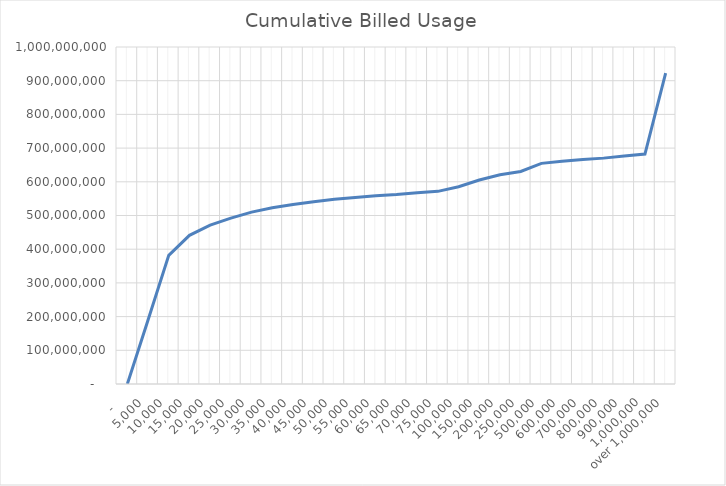
| Category | Series 0 |
|---|---|
|  -    | 0 |
|  5,000  | 189879200 |
|  10,000  | 381598700 |
|  15,000  | 441239800 |
|  20,000  | 471697300 |
|  25,000  | 492078800 |
|  30,000  | 509942700 |
|  35,000  | 523206500 |
|  40,000  | 532767800 |
|  45,000  | 541122300 |
|  50,000  | 548330100 |
|  55,000  | 553735300 |
|  60,000  | 558912600 |
|  65,000  | 562541700 |
|  70,000  | 567547100 |
|  75,000  | 571679300 |
|  100,000  | 585169000 |
|  150,000  | 605212000 |
|  200,000  | 620655800 |
|  250,000  | 630753600 |
|  500,000  | 654693000 |
|  600,000  | 660768900 |
|  700,000  | 665877000 |
|  800,000  | 670260300 |
|  900,000  | 676365700 |
|  1,000,000  | 682241100 |
|  over 1,000,000  | 922146600 |